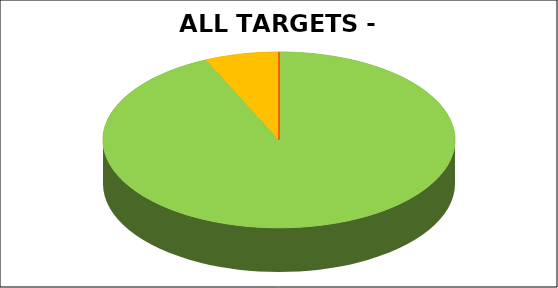
| Category | Series 0 |
|---|---|
| Green | 0.932 |
| Amber | 0.068 |
| Red | 0 |